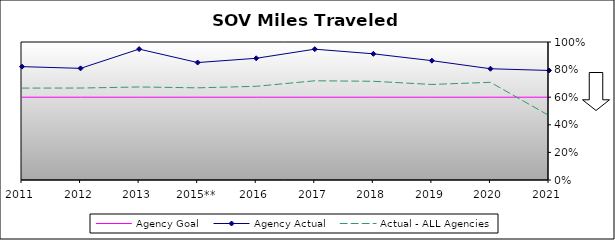
| Category | Agency Goal | Agency Actual | Actual - ALL Agencies |
|---|---|---|---|
| 2011 | 0.6 | 0.822 | 0.666 |
| 2012 | 0.6 | 0.809 | 0.666 |
| 2013 | 0.6 | 0.948 | 0.674 |
| 2015** | 0.6 | 0.851 | 0.668 |
| 2016 | 0.6 | 0.882 | 0.679 |
| 2017 | 0.6 | 0.948 | 0.719 |
| 2018 | 0.6 | 0.914 | 0.715 |
| 2019 | 0.6 | 0.865 | 0.692 |
| 2020 | 0.6 | 0.806 | 0.708 |
| 2021 | 0.6 | 0.794 | 0.467 |